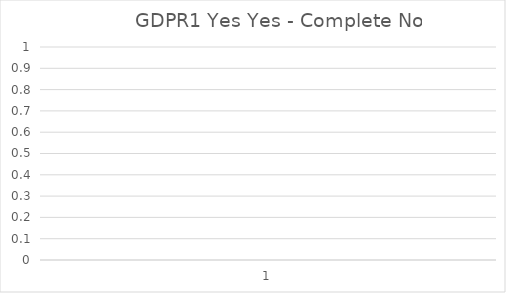
| Category | GDPR1 |
|---|---|
| 0 | 0 |